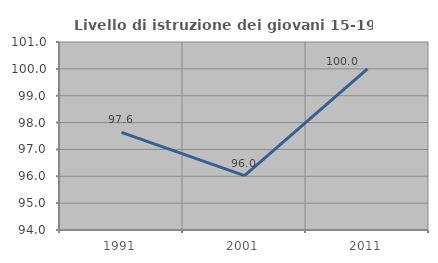
| Category | Livello di istruzione dei giovani 15-19 anni |
|---|---|
| 1991.0 | 97.635 |
| 2001.0 | 96.026 |
| 2011.0 | 100 |